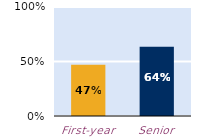
| Category | frequently |
|---|---|
| First-year | 0.469 |
| Senior | 0.635 |